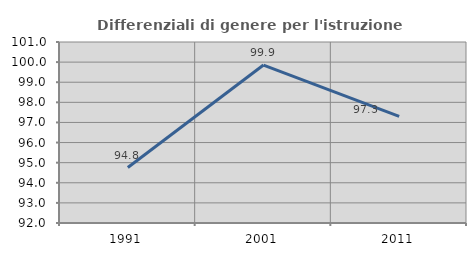
| Category | Differenziali di genere per l'istruzione superiore |
|---|---|
| 1991.0 | 94.757 |
| 2001.0 | 99.853 |
| 2011.0 | 97.299 |